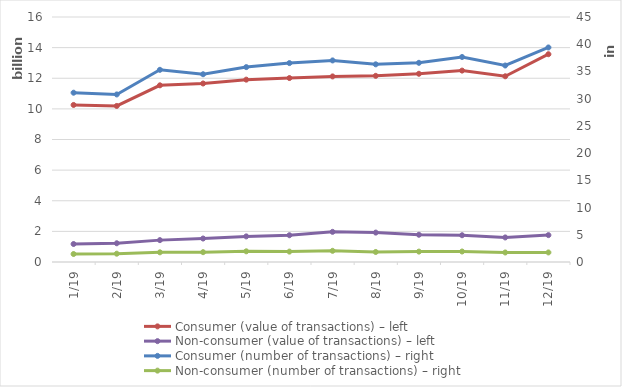
| Category | Consumer (value of transactions) – left | Non-consumer (value of transactions) – left |
|---|---|---|
| 2019-01-01 | 10256028672 | 1174704994 |
| 2019-02-01 | 10190906605 | 1223494692 |
| 2019-03-01 | 11537806714 | 1428615217 |
| 2019-04-01 | 11657498925 | 1532930956 |
| 2019-05-01 | 11908641119 | 1671723781 |
| 2019-06-01 | 12013485424 | 1747877657 |
| 2019-07-01 | 12119731561 | 1968537853 |
| 2019-08-01 | 12157346137 | 1921262771 |
| 2019-09-01 | 12292388883 | 1780038640 |
| 2019-10-01 | 12499657289 | 1747561950 |
| 2019-11-01 | 12128664384 | 1603354211 |
| 2019-12-01 | 13570132569 | 1755382788 |